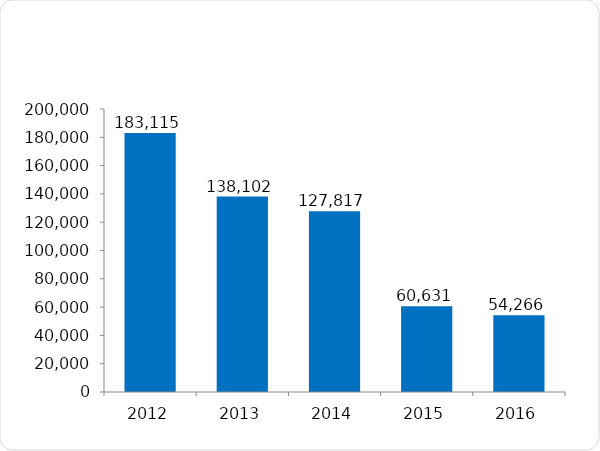
| Category | Personas Capacitadas |
|---|---|
| 2012 | 183115 |
| 2013 | 138102 |
| 2014 | 127817 |
| 2015 | 60631 |
| 2016 | 54266 |